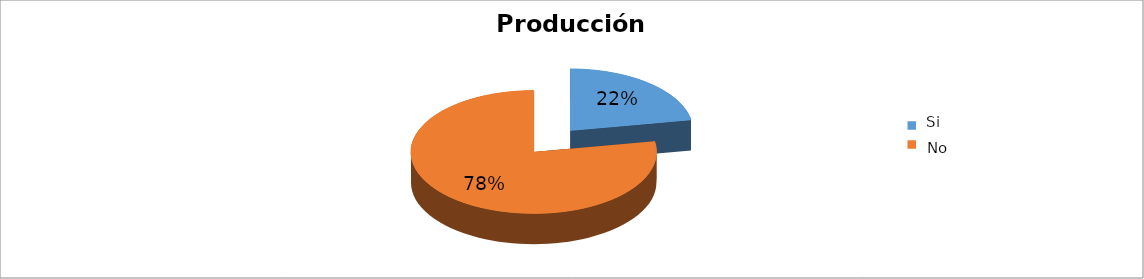
| Category | Series 0 |
|---|---|
| 0 | 0.222 |
| 1 | 0.778 |